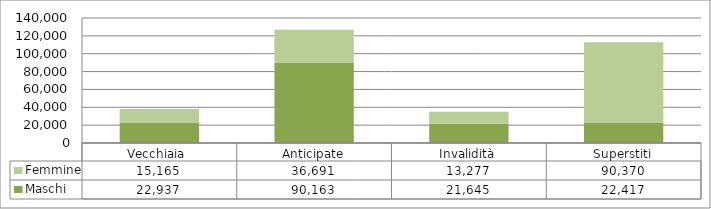
| Category | Maschi | Femmine |
|---|---|---|
| Vecchiaia  | 22937 | 15165 |
| Anticipate | 90163 | 36691 |
| Invalidità | 21645 | 13277 |
| Superstiti | 22417 | 90370 |